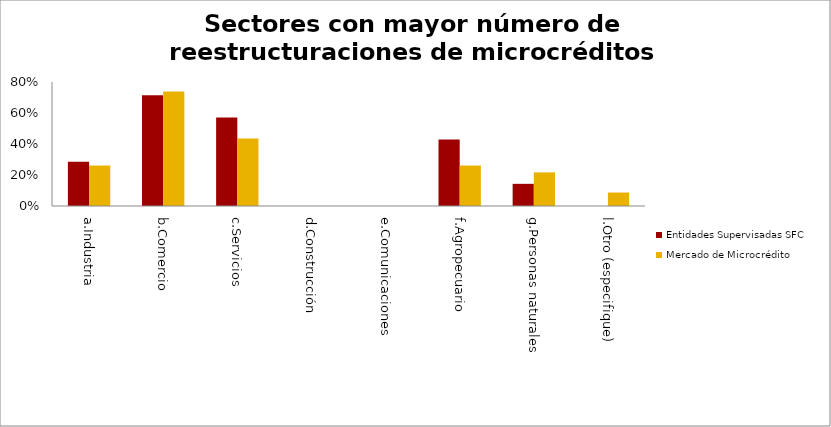
| Category | Entidades Supervisadas SFC | Mercado de Microcrédito |
|---|---|---|
| a.Industria | 0.286 | 0.261 |
| b.Comercio | 0.714 | 0.739 |
| c.Servicios | 0.571 | 0.435 |
| d.Construcción | 0 | 0 |
| e.Comunicaciones | 0 | 0 |
| f.Agropecuario | 0.429 | 0.261 |
| g.Personas naturales | 0.143 | 0.217 |
| l.Otro (especifique) | 0 | 0.087 |